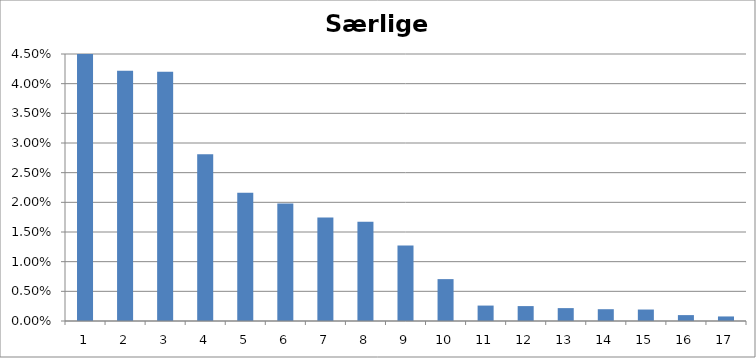
| Category | Series 0 |
|---|---|
| 0 | 0.355 |
| 1 | 0.042 |
| 2 | 0.042 |
| 3 | 0.028 |
| 4 | 0.022 |
| 5 | 0.02 |
| 6 | 0.017 |
| 7 | 0.017 |
| 8 | 0.013 |
| 9 | 0.007 |
| 10 | 0.003 |
| 11 | 0.003 |
| 12 | 0.002 |
| 13 | 0.002 |
| 14 | 0.002 |
| 15 | 0.001 |
| 16 | 0.001 |